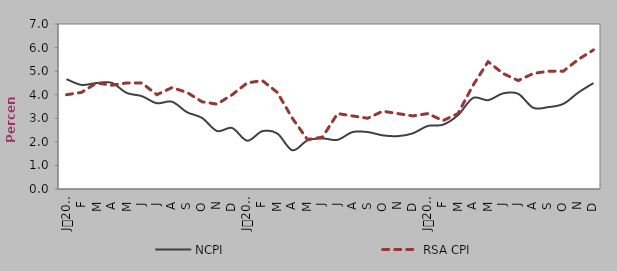
| Category | NCPI | RSA CPI |
|---|---|---|
| 0 | 4.658 | 4 |
| 1900-01-01 | 4.416 | 4.1 |
| 1900-01-02 | 4.498 | 4.5 |
| 1900-01-03 | 4.503 | 4.4 |
| 1900-01-04 | 4.076 | 4.5 |
| 1900-01-05 | 3.939 | 4.5 |
| 1900-01-06 | 3.639 | 4 |
| 1900-01-07 | 3.705 | 4.3 |
| 1900-01-08 | 3.259 | 4.1 |
| 1900-01-09 | 3.015 | 3.7 |
| 1900-01-10 | 2.461 | 3.6 |
| 1900-01-11 | 2.588 | 4 |
| 1900-01-12 | 2.05 | 4.5 |
| 1900-01-13 | 2.45 | 4.6 |
| 1900-01-14 | 2.354 | 4.1 |
| 1900-01-15 | 1.643 | 3 |
| 1900-01-16 | 2.06 | 2.1 |
| 1900-01-17 | 2.145 | 2.2 |
| 1900-01-18 | 2.087 | 3.2 |
| 1900-01-19 | 2.416 | 3.1 |
| 1900-01-20 | 2.416 | 3 |
| 1900-01-21 | 2.277 | 3.3 |
| 1900-01-22 | 2.242 | 3.2 |
| 1900-01-23 | 2.361 | 3.1 |
| 1900-01-24 | 2.676 | 3.2 |
| 1900-01-25 | 2.728 | 2.9 |
| 1900-01-26 | 3.133 | 3.2 |
| 1900-01-27 | 3.861 | 4.4 |
| 1900-01-28 | 3.769 | 5.4 |
| 1900-01-29 | 4.057 | 4.9 |
| 1900-01-30 | 4.038 | 4.6 |
| 1900-01-31 | 3.445 | 4.9 |
| 1900-02-01 | 3.474 | 5 |
| 1900-02-02 | 3.612 | 5 |
| 1900-02-03 | 4.095 | 5.5 |
| 1900-02-04 | 4.494 | 5.9 |